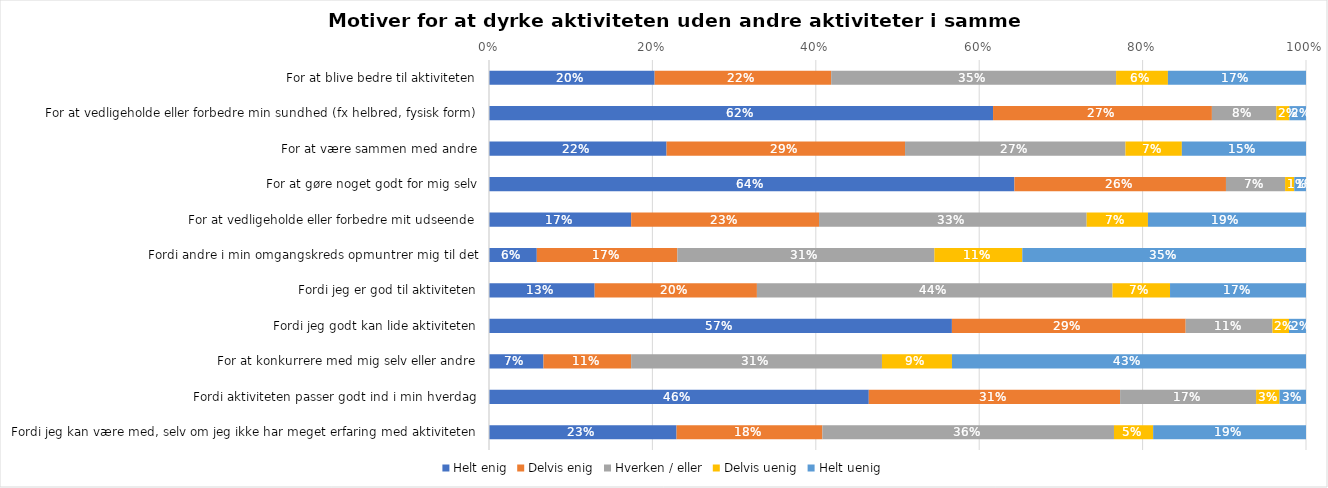
| Category | Helt enig | Delvis enig | Hverken / eller | Delvis uenig | Helt uenig |
|---|---|---|---|---|---|
| For at blive bedre til aktiviteten | 0.203 | 0.216 | 0.349 | 0.063 | 0.169 |
| For at vedligeholde eller forbedre min sundhed (fx helbred, fysisk form) | 0.617 | 0.268 | 0.079 | 0.016 | 0.02 |
| For at være sammen med andre | 0.217 | 0.292 | 0.27 | 0.069 | 0.152 |
| For at gøre noget godt for mig selv | 0.643 | 0.259 | 0.072 | 0.011 | 0.014 |
| For at vedligeholde eller forbedre mit udseende | 0.174 | 0.23 | 0.328 | 0.075 | 0.193 |
| Fordi andre i min omgangskreds opmuntrer mig til det | 0.059 | 0.172 | 0.315 | 0.108 | 0.347 |
| Fordi jeg er god til aktiviteten | 0.129 | 0.199 | 0.435 | 0.07 | 0.166 |
| Fordi jeg godt kan lide aktiviteten | 0.567 | 0.286 | 0.106 | 0.02 | 0.021 |
| For at konkurrere med mig selv eller andre | 0.067 | 0.107 | 0.307 | 0.086 | 0.433 |
| Fordi aktiviteten passer godt ind i min hverdag | 0.465 | 0.308 | 0.166 | 0.029 | 0.032 |
| Fordi jeg kan være med, selv om jeg ikke har meget erfaring med aktiviteten | 0.23 | 0.179 | 0.357 | 0.048 | 0.187 |